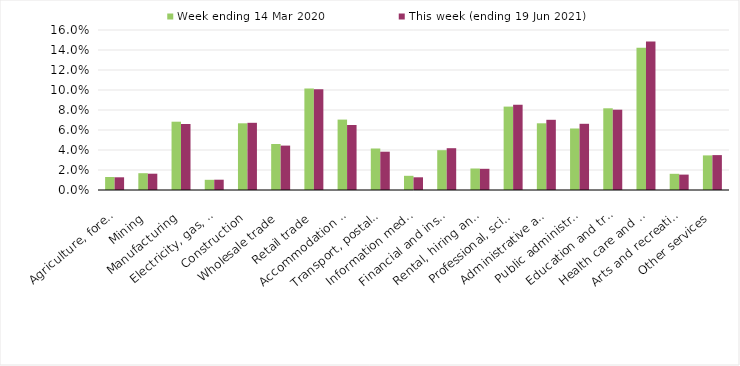
| Category | Week ending 14 Mar 2020 | This week (ending 19 Jun 2021) |
|---|---|---|
| Agriculture, forestry and fishing | 0.013 | 0.013 |
| Mining | 0.017 | 0.016 |
| Manufacturing | 0.068 | 0.066 |
| Electricity, gas, water and waste services | 0.01 | 0.01 |
| Construction | 0.067 | 0.067 |
| Wholesale trade | 0.046 | 0.044 |
| Retail trade | 0.102 | 0.101 |
| Accommodation and food services | 0.07 | 0.065 |
| Transport, postal and warehousing | 0.042 | 0.038 |
| Information media and telecommunications | 0.014 | 0.013 |
| Financial and insurance services | 0.04 | 0.042 |
| Rental, hiring and real estate services | 0.022 | 0.021 |
| Professional, scientific and technical services | 0.083 | 0.085 |
| Administrative and support services | 0.067 | 0.07 |
| Public administration and safety | 0.062 | 0.066 |
| Education and training | 0.082 | 0.08 |
| Health care and social assistance | 0.142 | 0.148 |
| Arts and recreation services | 0.016 | 0.015 |
| Other services | 0.035 | 0.035 |